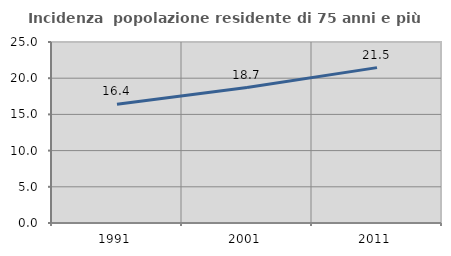
| Category | Incidenza  popolazione residente di 75 anni e più |
|---|---|
| 1991.0 | 16.409 |
| 2001.0 | 18.713 |
| 2011.0 | 21.459 |